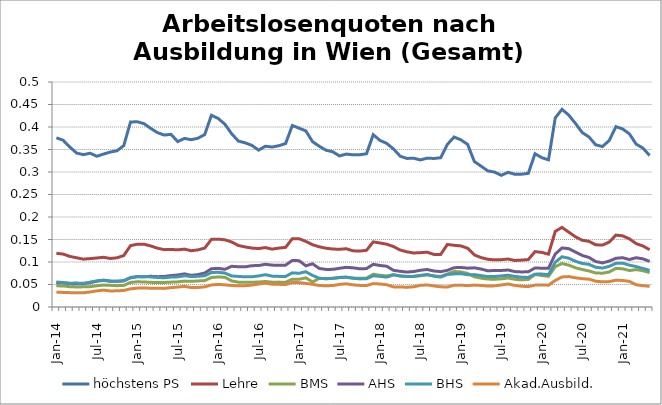
| Category | höchstens PS | Lehre | BMS | AHS | BHS | Akad.Ausbild. |
|---|---|---|---|---|---|---|
| 2014-01-01 | 0.376 | 0.119 | 0.047 | 0.054 | 0.056 | 0.033 |
| 2014-02-01 | 0.371 | 0.118 | 0.047 | 0.054 | 0.054 | 0.032 |
| 2014-03-01 | 0.355 | 0.112 | 0.045 | 0.052 | 0.053 | 0.032 |
| 2014-04-01 | 0.342 | 0.109 | 0.045 | 0.052 | 0.053 | 0.032 |
| 2014-05-01 | 0.339 | 0.106 | 0.045 | 0.052 | 0.053 | 0.032 |
| 2014-06-01 | 0.342 | 0.108 | 0.045 | 0.054 | 0.055 | 0.033 |
| 2014-07-01 | 0.335 | 0.109 | 0.047 | 0.057 | 0.058 | 0.036 |
| 2014-08-01 | 0.34 | 0.11 | 0.049 | 0.06 | 0.059 | 0.037 |
| 2014-09-01 | 0.344 | 0.108 | 0.048 | 0.057 | 0.058 | 0.036 |
| 2014-10-01 | 0.347 | 0.109 | 0.047 | 0.057 | 0.057 | 0.036 |
| 2014-11-01 | 0.359 | 0.114 | 0.048 | 0.058 | 0.058 | 0.037 |
| 2014-12-01 | 0.411 | 0.136 | 0.055 | 0.065 | 0.066 | 0.04 |
| 2015-01-01 | 0.412 | 0.139 | 0.056 | 0.068 | 0.067 | 0.042 |
| 2015-02-01 | 0.407 | 0.14 | 0.056 | 0.067 | 0.067 | 0.042 |
| 2015-03-01 | 0.397 | 0.136 | 0.055 | 0.068 | 0.067 | 0.042 |
| 2015-04-01 | 0.387 | 0.131 | 0.054 | 0.067 | 0.066 | 0.042 |
| 2015-05-01 | 0.382 | 0.127 | 0.055 | 0.068 | 0.065 | 0.041 |
| 2015-06-01 | 0.384 | 0.128 | 0.055 | 0.07 | 0.066 | 0.043 |
| 2015-07-01 | 0.368 | 0.127 | 0.056 | 0.071 | 0.067 | 0.044 |
| 2015-08-01 | 0.375 | 0.129 | 0.058 | 0.074 | 0.069 | 0.046 |
| 2015-09-01 | 0.372 | 0.125 | 0.057 | 0.07 | 0.068 | 0.043 |
| 2015-10-01 | 0.375 | 0.127 | 0.058 | 0.072 | 0.068 | 0.043 |
| 2015-11-01 | 0.383 | 0.131 | 0.059 | 0.075 | 0.069 | 0.045 |
| 2015-12-01 | 0.426 | 0.15 | 0.066 | 0.085 | 0.077 | 0.049 |
| 2016-01-01 | 0.419 | 0.151 | 0.067 | 0.086 | 0.077 | 0.05 |
| 2016-02-01 | 0.406 | 0.149 | 0.066 | 0.084 | 0.075 | 0.049 |
| 2016-03-01 | 0.385 | 0.145 | 0.058 | 0.09 | 0.069 | 0.048 |
| 2016-04-01 | 0.369 | 0.137 | 0.055 | 0.089 | 0.068 | 0.047 |
| 2016-05-01 | 0.365 | 0.133 | 0.055 | 0.089 | 0.067 | 0.047 |
| 2016-06-01 | 0.359 | 0.131 | 0.055 | 0.092 | 0.067 | 0.049 |
| 2016-07-01 | 0.349 | 0.13 | 0.055 | 0.092 | 0.069 | 0.051 |
| 2016-08-01 | 0.357 | 0.132 | 0.057 | 0.095 | 0.072 | 0.053 |
| 2016-09-01 | 0.356 | 0.129 | 0.055 | 0.093 | 0.069 | 0.051 |
| 2016-10-01 | 0.358 | 0.131 | 0.055 | 0.093 | 0.068 | 0.05 |
| 2016-11-01 | 0.363 | 0.133 | 0.055 | 0.093 | 0.068 | 0.05 |
| 2016-12-01 | 0.403 | 0.152 | 0.062 | 0.103 | 0.076 | 0.055 |
| 2017-01-01 | 0.397 | 0.152 | 0.062 | 0.103 | 0.075 | 0.054 |
| 2017-02-01 | 0.391 | 0.146 | 0.065 | 0.092 | 0.078 | 0.053 |
| 2017-03-01 | 0.367 | 0.138 | 0.056 | 0.096 | 0.07 | 0.05 |
| 2017-04-01 | 0.357 | 0.134 | 0.063 | 0.086 | 0.064 | 0.048 |
| 2017-05-01 | 0.348 | 0.131 | 0.063 | 0.084 | 0.063 | 0.047 |
| 2017-06-01 | 0.345 | 0.129 | 0.063 | 0.084 | 0.064 | 0.048 |
| 2017-07-01 | 0.336 | 0.128 | 0.065 | 0.086 | 0.066 | 0.05 |
| 2017-08-01 | 0.34 | 0.129 | 0.066 | 0.088 | 0.066 | 0.052 |
| 2017-09-01 | 0.338 | 0.125 | 0.064 | 0.087 | 0.064 | 0.049 |
| 2017-10-01 | 0.338 | 0.124 | 0.064 | 0.085 | 0.062 | 0.048 |
| 2017-11-01 | 0.34 | 0.126 | 0.064 | 0.085 | 0.063 | 0.048 |
| 2017-12-01 | 0.383 | 0.145 | 0.073 | 0.095 | 0.069 | 0.052 |
| 2018-01-01 | 0.37 | 0.142 | 0.071 | 0.092 | 0.068 | 0.051 |
| 2018-02-01 | 0.364 | 0.14 | 0.069 | 0.091 | 0.066 | 0.049 |
| 2018-03-01 | 0.351 | 0.134 | 0.072 | 0.081 | 0.071 | 0.045 |
| 2018-04-01 | 0.335 | 0.127 | 0.069 | 0.079 | 0.069 | 0.044 |
| 2018-05-01 | 0.33 | 0.123 | 0.068 | 0.078 | 0.068 | 0.044 |
| 2018-06-01 | 0.331 | 0.12 | 0.068 | 0.079 | 0.068 | 0.045 |
| 2018-07-01 | 0.327 | 0.121 | 0.069 | 0.082 | 0.07 | 0.048 |
| 2018-08-01 | 0.331 | 0.122 | 0.071 | 0.083 | 0.072 | 0.049 |
| 2018-09-01 | 0.33 | 0.117 | 0.069 | 0.08 | 0.069 | 0.047 |
| 2018-10-01 | 0.332 | 0.117 | 0.068 | 0.079 | 0.066 | 0.045 |
| 2018-11-01 | 0.361 | 0.139 | 0.073 | 0.081 | 0.072 | 0.044 |
| 2018-12-01 | 0.378 | 0.137 | 0.079 | 0.087 | 0.074 | 0.048 |
| 2019-01-01 | 0.371 | 0.136 | 0.078 | 0.088 | 0.074 | 0.049 |
| 2019-02-01 | 0.361 | 0.131 | 0.075 | 0.086 | 0.072 | 0.047 |
| 2019-03-01 | 0.323 | 0.116 | 0.067 | 0.087 | 0.072 | 0.049 |
| 2019-04-01 | 0.313 | 0.11 | 0.064 | 0.084 | 0.07 | 0.048 |
| 2019-05-01 | 0.303 | 0.106 | 0.062 | 0.08 | 0.067 | 0.047 |
| 2019-06-01 | 0.3 | 0.105 | 0.062 | 0.081 | 0.068 | 0.047 |
| 2019-07-01 | 0.293 | 0.105 | 0.063 | 0.081 | 0.069 | 0.049 |
| 2019-08-01 | 0.299 | 0.107 | 0.064 | 0.082 | 0.071 | 0.051 |
| 2019-09-01 | 0.295 | 0.103 | 0.062 | 0.079 | 0.068 | 0.048 |
| 2019-10-01 | 0.295 | 0.104 | 0.06 | 0.078 | 0.066 | 0.046 |
| 2019-11-01 | 0.297 | 0.105 | 0.061 | 0.078 | 0.066 | 0.045 |
| 2019-12-01 | 0.341 | 0.123 | 0.072 | 0.087 | 0.073 | 0.049 |
| 2020-01-01 | 0.332 | 0.121 | 0.07 | 0.086 | 0.073 | 0.049 |
| 2020-02-01 | 0.327 | 0.117 | 0.068 | 0.086 | 0.072 | 0.048 |
| 2020-03-01 | 0.42 | 0.168 | 0.09 | 0.118 | 0.1 | 0.059 |
| 2020-04-01 | 0.439 | 0.177 | 0.097 | 0.131 | 0.112 | 0.067 |
| 2020-05-01 | 0.427 | 0.166 | 0.093 | 0.13 | 0.109 | 0.068 |
| 2020-06-01 | 0.408 | 0.156 | 0.087 | 0.122 | 0.102 | 0.065 |
| 2020-07-01 | 0.388 | 0.148 | 0.083 | 0.115 | 0.097 | 0.063 |
| 2020-08-01 | 0.378 | 0.146 | 0.08 | 0.11 | 0.095 | 0.062 |
| 2020-09-01 | 0.36 | 0.138 | 0.076 | 0.101 | 0.088 | 0.057 |
| 2020-10-01 | 0.357 | 0.138 | 0.075 | 0.098 | 0.087 | 0.056 |
| 2020-11-01 | 0.37 | 0.144 | 0.078 | 0.102 | 0.09 | 0.056 |
| 2020-12-01 | 0.401 | 0.16 | 0.086 | 0.108 | 0.097 | 0.06 |
| 2021-01-01 | 0.396 | 0.158 | 0.085 | 0.109 | 0.097 | 0.059 |
| 2021-02-01 | 0.385 | 0.151 | 0.081 | 0.106 | 0.093 | 0.057 |
| 2021-03-01 | 0.362 | 0.141 | 0.083 | 0.109 | 0.09 | 0.049 |
| 2021-04-01 | 0.353 | 0.136 | 0.081 | 0.107 | 0.086 | 0.047 |
| 2021-05-01 | 0.337 | 0.127 | 0.076 | 0.101 | 0.081 | 0.046 |